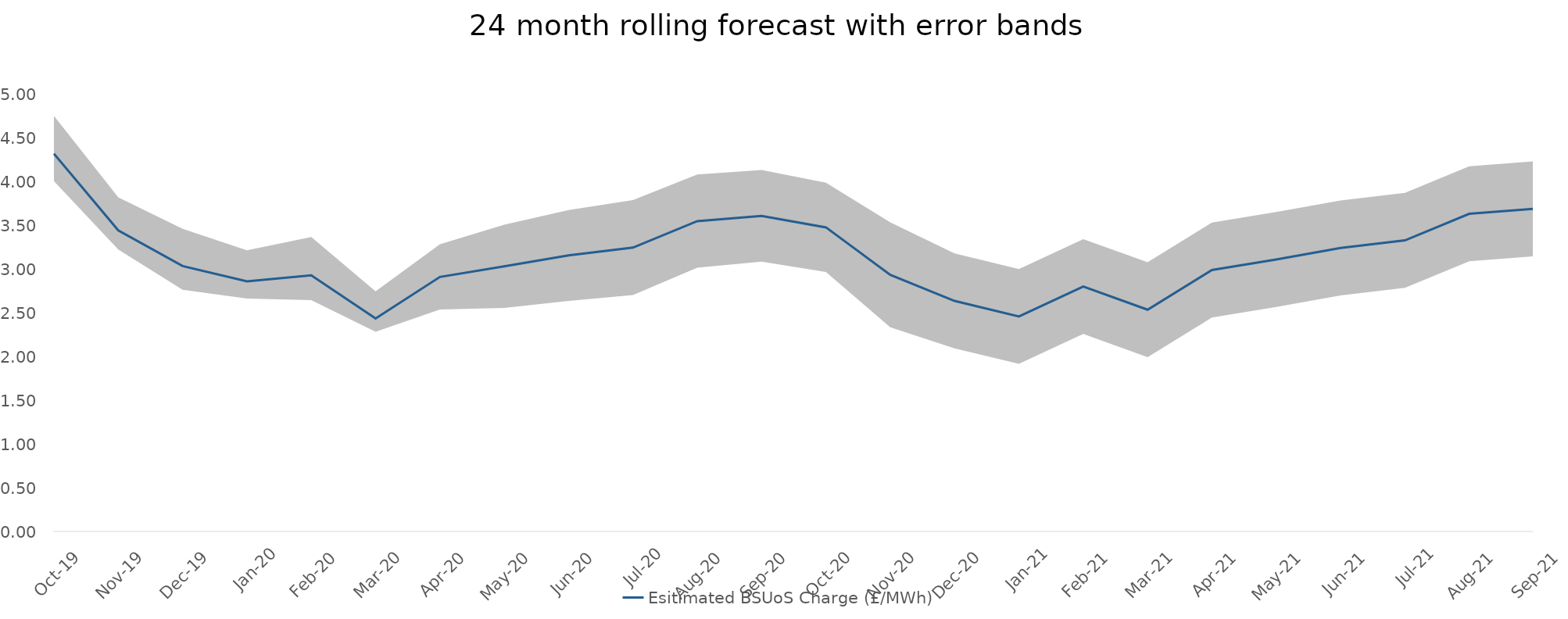
| Category | Esitimated BSUoS Charge (£/MWh) |
|---|---|
| Oct-19 | 4.323 |
| Nov-19 | 3.446 |
| Dec-19 | 3.038 |
| Jan-20 | 2.863 |
| Feb-20 | 2.931 |
| Mar-20 | 2.438 |
| Apr-20 | 2.913 |
| May-20 | 3.035 |
| Jun-20 | 3.159 |
| Jul-20 | 3.249 |
| Aug-20 | 3.552 |
| Sep-20 | 3.612 |
| Oct-20 | 3.48 |
| Nov-20 | 2.937 |
| Dec-20 | 2.638 |
| Jan-21 | 2.461 |
| Feb-21 | 2.803 |
| Mar-21 | 2.538 |
| Apr-21 | 2.993 |
| May-21 | 3.113 |
| Jun-21 | 3.244 |
| Jul-21 | 3.331 |
| Aug-21 | 3.635 |
| Sep-21 | 3.693 |